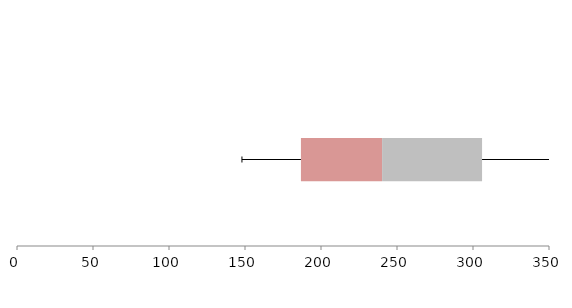
| Category | Series 1 | Series 2 | Series 3 |
|---|---|---|---|
| 0 | 186.8 | 53.4 | 65.757 |